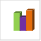
| Category | област Ямбол |
|---|---|
| летен сезон 2019  | 15284 |
| летен сезон 2021  | 11710 |
| летен сезон 2022 г.  | 17526 |